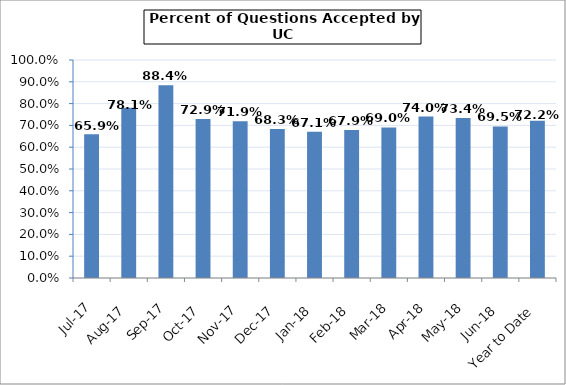
| Category | Series 0 |
|---|---|
| Jul-17 | 0.659 |
| Aug-17 | 0.781 |
| Sep-17 | 0.884 |
| Oct-17 | 0.729 |
| Nov-17 | 0.719 |
| Dec-17 | 0.683 |
| Jan-18 | 0.671 |
| Feb-18 | 0.679 |
| Mar-18 | 0.69 |
| Apr-18 | 0.74 |
| May-18 | 0.734 |
| Jun-18 | 0.695 |
| Year to Date | 0.722 |